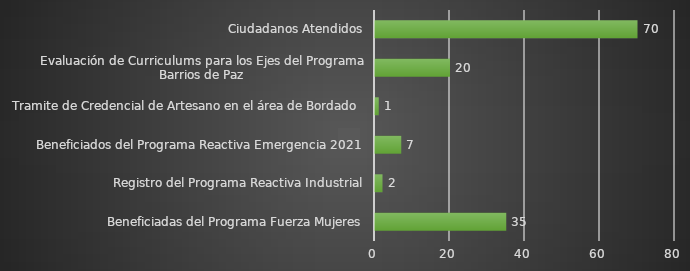
| Category | INDICADOR  |
|---|---|
| Beneficiadas del Programa Fuerza Mujeres | 35 |
| Registro del Programa Reactiva Industrial | 2 |
| Beneficiados del Programa Reactiva Emergencia 2021 | 7 |
| Tramite de Credencial de Artesano en el área de Bordado  | 1 |
| Evaluación de Curriculums para los Ejes del Programa Barrios de Paz | 20 |
| Ciudadanos Atendidos | 70 |